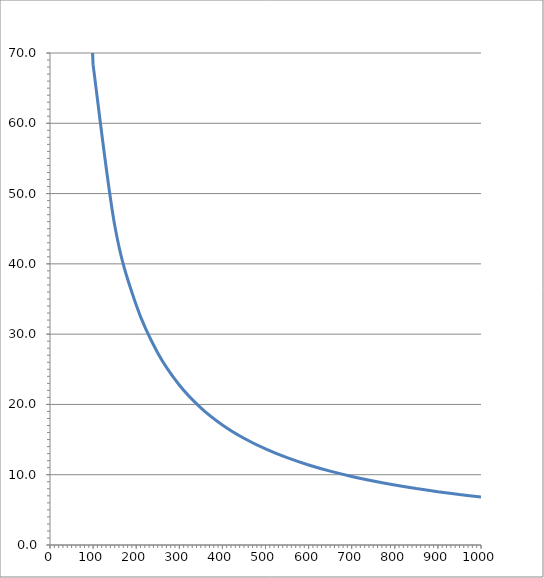
| Category | Series 0 |
|---|---|
| 1000.0 | 6.831 |
| 950.0 | 7.19 |
| 900.0 | 7.59 |
| 850.0 | 8.036 |
| 800.0 | 8.538 |
| 750.0 | 9.108 |
| 700.0 | 9.758 |
| 650.0 | 10.509 |
| 600.0 | 11.385 |
| 550.0 | 12.42 |
| 500.0 | 13.662 |
| 450.0 | 15.179 |
| 400.0 | 17.077 |
| 350.0 | 19.516 |
| 300.0 | 22.769 |
| 250.0 | 27.323 |
| 200.0 | 34.154 |
| 150.0 | 45.538 |
| 100.0 | 68.308 |
| 50.0 | 136.615 |